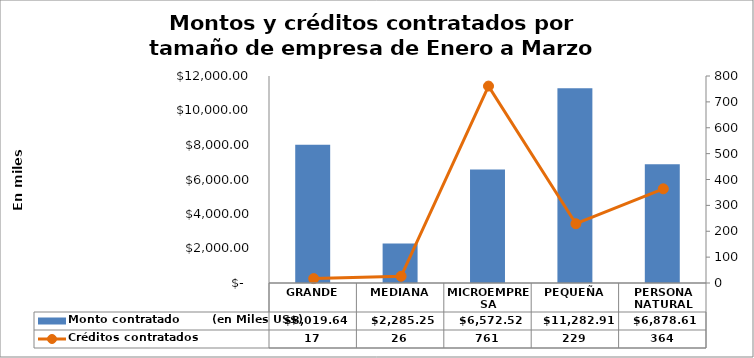
| Category | Monto contratado        (en Miles US$) |
|---|---|
| GRANDE | 8019.643 |
| MEDIANA | 2285.25 |
| MICROEMPRESA | 6572.522 |
| PEQUEÑA | 11282.912 |
| PERSONA NATURAL | 6878.614 |